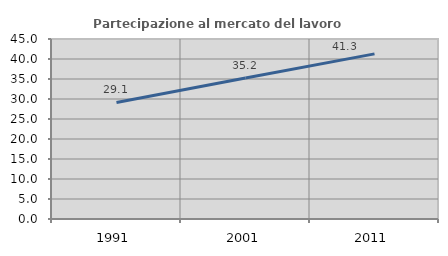
| Category | Partecipazione al mercato del lavoro  femminile |
|---|---|
| 1991.0 | 29.145 |
| 2001.0 | 35.235 |
| 2011.0 | 41.279 |